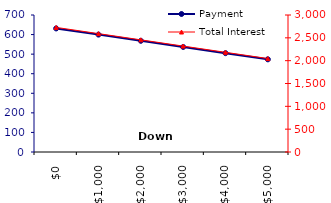
| Category | Payment |
|---|---|
| 0.0 | 631.35 |
| 1000.0 | 599.78 |
| 2000.0 | 568.22 |
| 3000.0 | 536.65 |
| 4000.0 | 505.08 |
| 5000.0 | 473.51 |